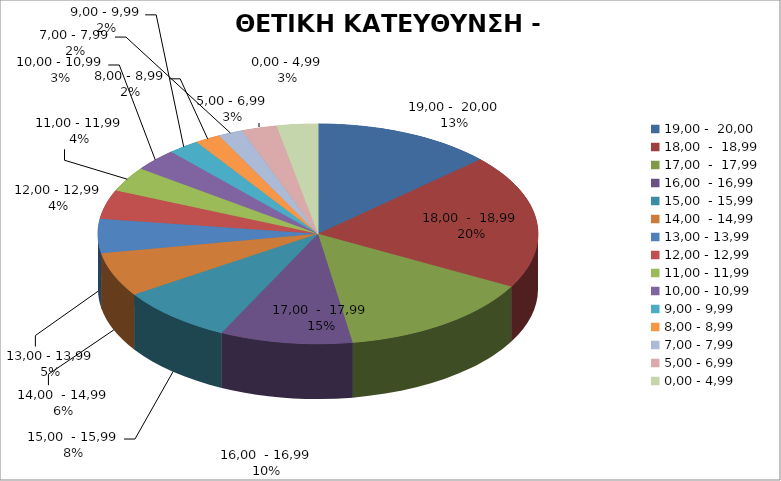
| Category | ΘΕΤΙΚΗ ΚΑΤΕΥΘΥΝΣΗ - 2010 |
|---|---|
| 19,00 -  20,00 | 13.175 |
| 18,00  -  18,99 | 19.777 |
| 17,00  -  17,99 | 14.535 |
| 16,00  - 16,99 | 9.726 |
| 15,00  - 15,99 | 8.484 |
| 14,00  - 14,99 | 6.484 |
| 13,00 - 13,99 | 5.026 |
| 12,00 - 12,99 | 4.267 |
| 11,00 - 11,99 | 3.636 |
| 10,00 - 10,99 | 3.281 |
| 9,00 - 9,99 | 2.316 |
| 8,00 - 8,99 | 1.862 |
| 7,00 - 7,99 | 1.833 |
| 5,00 - 6,99 | 2.582 |
| 0,00 - 4,99 | 3.015 |